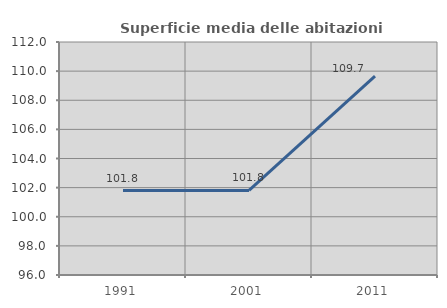
| Category | Superficie media delle abitazioni occupate |
|---|---|
| 1991.0 | 101.796 |
| 2001.0 | 101.809 |
| 2011.0 | 109.656 |